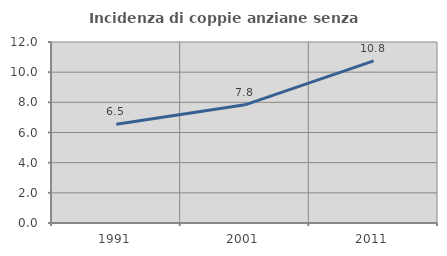
| Category | Incidenza di coppie anziane senza figli  |
|---|---|
| 1991.0 | 6.54 |
| 2001.0 | 7.836 |
| 2011.0 | 10.753 |